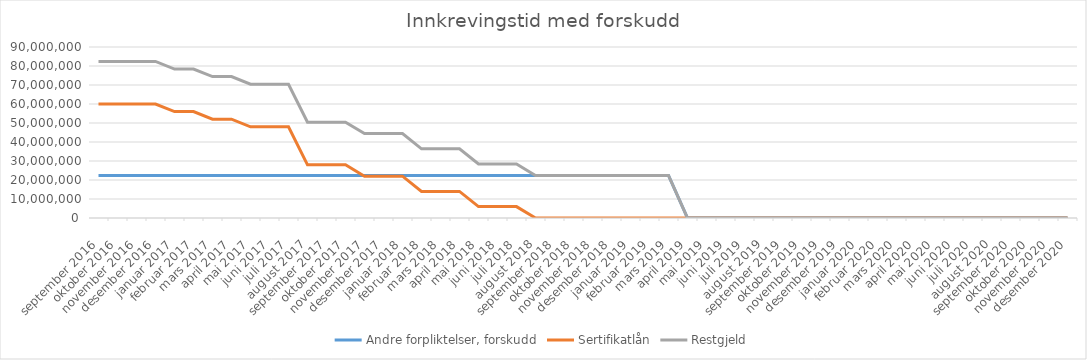
| Category | Andre forpliktelser, forskudd | Sertifikatlån | Restgjeld |
|---|---|---|---|
| 2016-09-01 | 22411000 | 60000000 | 82411000 |
| 2016-10-01 | 22411000 | 60000000 | 82411000 |
| 2016-11-01 | 22411000 | 60000000 | 82411000 |
| 2016-12-01 | 22411000 | 60000000 | 82411000 |
| 2017-01-01 | 22411000 | 56000000 | 78411000 |
| 2017-02-01 | 22411000 | 56000000 | 78411000 |
| 2017-03-01 | 22411000 | 52000000 | 74411000 |
| 2017-04-01 | 22411000 | 52000000 | 74411000 |
| 2017-05-01 | 22411000 | 48000000 | 70411000 |
| 2017-06-01 | 22411000 | 48000000 | 70411000 |
| 2017-07-01 | 22411000 | 48000000 | 70411000 |
| 2017-08-01 | 22411000 | 28000000 | 50411000 |
| 2017-09-01 | 22411000 | 28000000 | 50411000 |
| 2017-10-01 | 22411000 | 28000000 | 50411000 |
| 2017-11-01 | 22411000 | 22000000 | 44411000 |
| 2017-12-01 | 22411000 | 22000000 | 44411000 |
| 2018-01-01 | 22411000 | 22000000 | 44411000 |
| 2018-02-01 | 22411000 | 14000000 | 36411000 |
| 2018-03-01 | 22411000 | 14000000 | 36411000 |
| 2018-04-01 | 22411000 | 14000000 | 36411000 |
| 2018-05-01 | 22411000 | 6000000 | 28411000 |
| 2018-06-01 | 22411000 | 6000000 | 28411000 |
| 2018-07-01 | 22411000 | 6000000 | 28411000 |
| 2018-08-01 | 22411000 | 0 | 22411000 |
| 2018-09-01 | 22411000 | 0 | 22411000 |
| 2018-10-01 | 22411000 | 0 | 22411000 |
| 2018-11-01 | 22411000 | 0 | 22411000 |
| 2018-12-01 | 22411000 | 0 | 22411000 |
| 2019-01-01 | 22411000 | 0 | 22411000 |
| 2019-02-01 | 22411000 | 0 | 22411000 |
| 2019-03-01 | 22411000 | 0 | 22411000 |
| 2019-04-01 | 0 | 0 | 0 |
| 2019-05-01 | 0 | 0 | 0 |
| 2019-06-01 | 0 | 0 | 0 |
| 2019-07-01 | 0 | 0 | 0 |
| 2019-08-01 | 0 | 0 | 0 |
| 2019-09-01 | 0 | 0 | 0 |
| 2019-10-01 | 0 | 0 | 0 |
| 2019-11-01 | 0 | 0 | 0 |
| 2019-12-01 | 0 | 0 | 0 |
| 2020-01-01 | 0 | 0 | 0 |
| 2020-02-01 | 0 | 0 | 0 |
| 2020-03-01 | 0 | 0 | 0 |
| 2020-04-01 | 0 | 0 | 0 |
| 2020-05-01 | 0 | 0 | 0 |
| 2020-06-01 | 0 | 0 | 0 |
| 2020-07-01 | 0 | 0 | 0 |
| 2020-08-01 | 0 | 0 | 0 |
| 2020-09-01 | 0 | 0 | 0 |
| 2020-10-01 | 0 | 0 | 0 |
| 2020-11-01 | 0 | 0 | 0 |
| 2020-12-01 | 0 | 0 | 0 |